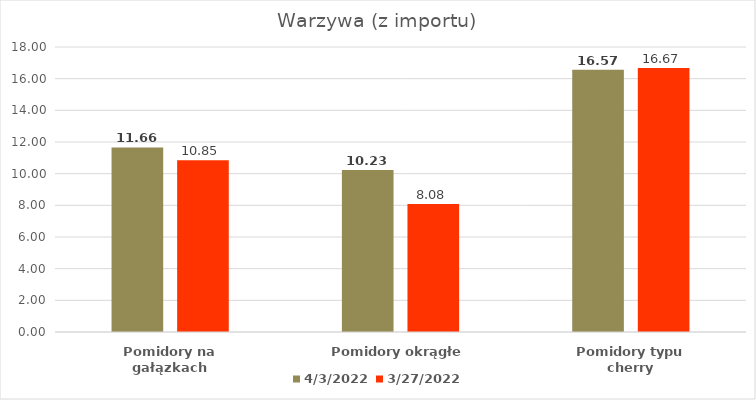
| Category | 2022-04-03 | 2022-03-27 |
|---|---|---|
| Pomidory na gałązkach | 11.66 | 10.85 |
| Pomidory okrągłe | 10.23 | 8.08 |
| Pomidory typu cherry | 16.57 | 16.67 |